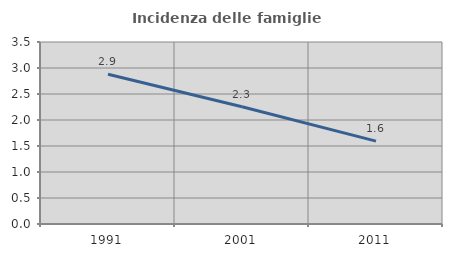
| Category | Incidenza delle famiglie numerose |
|---|---|
| 1991.0 | 2.881 |
| 2001.0 | 2.256 |
| 2011.0 | 1.594 |